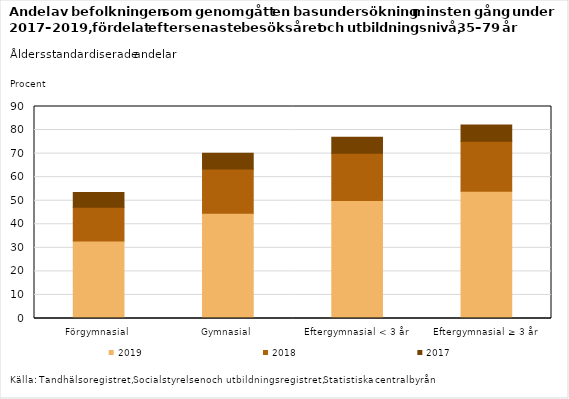
| Category | 2019 | 2018 | 2017 |
|---|---|---|---|
| Förgymnasial | 32.9 | 14.3 | 6.3 |
| Gymnasial | 44.7 | 18.8 | 6.7 |
| Eftergymnasial < 3 år | 50.1 | 20.1 | 6.7 |
| Eftergymnasial ≥ 3 år | 54 | 21.3 | 6.8 |